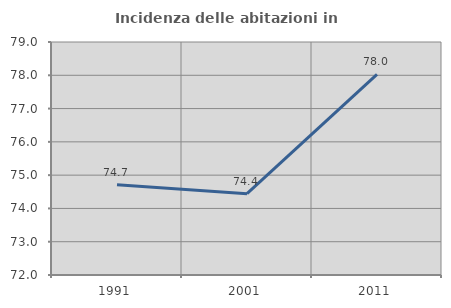
| Category | Incidenza delle abitazioni in proprietà  |
|---|---|
| 1991.0 | 74.711 |
| 2001.0 | 74.444 |
| 2011.0 | 78.029 |